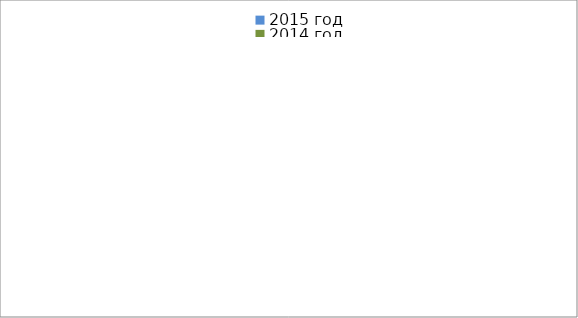
| Category | 2015 год | 2014 год |
|---|---|---|
|  - поджог | 19 | 20 |
|  - неосторожное обращение с огнём | 55 | 38 |
|  - НПТЭ электрооборудования | 8 | 18 |
|  - НПУ и Э печей | 62 | 55 |
|  - НПУ и Э транспортных средств | 42 | 49 |
|   -Шалость с огнем детей | 3 | 0 |
|  -НППБ при эксплуатации эл.приборов | 12 | 19 |
|  - курение | 21 | 20 |
| - прочие | 80 | 82 |
| - не установленные причины | 10 | 8 |